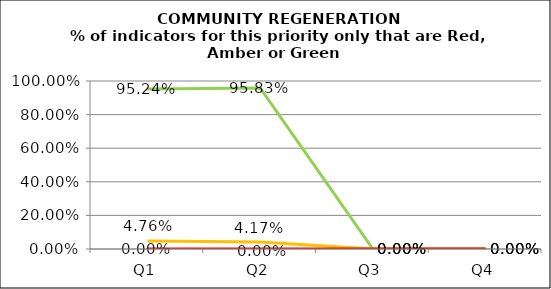
| Category | Green | Amber | Red |
|---|---|---|---|
| Q1 | 0.952 | 0.048 | 0 |
| Q2 | 0.958 | 0.042 | 0 |
| Q3 | 0 | 0 | 0 |
| Q4 | 0 | 0 | 0 |